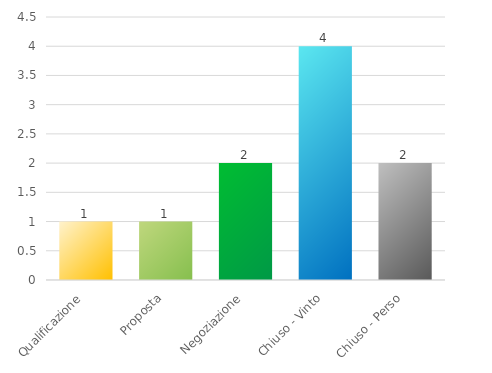
| Category | Series 0 |
|---|---|
| Qualificazione | 1 |
| Proposta | 1 |
| Negoziazione | 2 |
| Chiuso - Vinto | 4 |
| Chiuso - Perso | 2 |